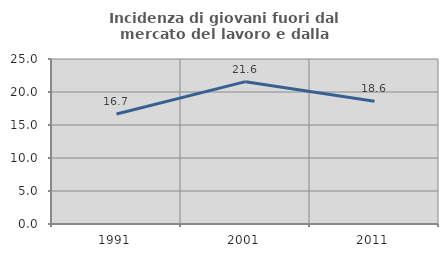
| Category | Incidenza di giovani fuori dal mercato del lavoro e dalla formazione  |
|---|---|
| 1991.0 | 16.667 |
| 2001.0 | 21.569 |
| 2011.0 | 18.605 |